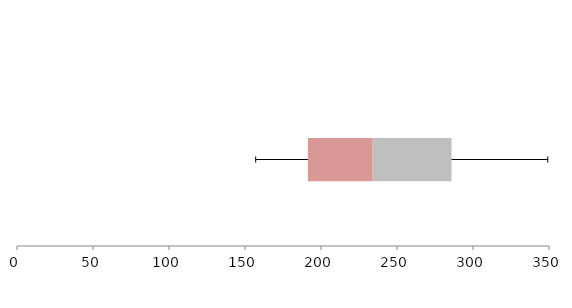
| Category | Series 1 | Series 2 | Series 3 |
|---|---|---|---|
| 0 | 191.376 | 42.599 | 51.912 |